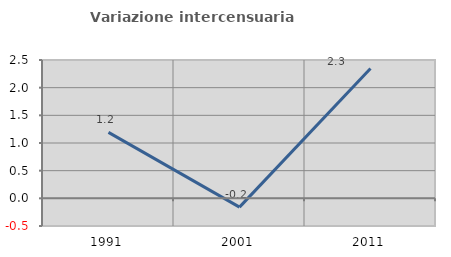
| Category | Variazione intercensuaria annua |
|---|---|
| 1991.0 | 1.192 |
| 2001.0 | -0.159 |
| 2011.0 | 2.346 |